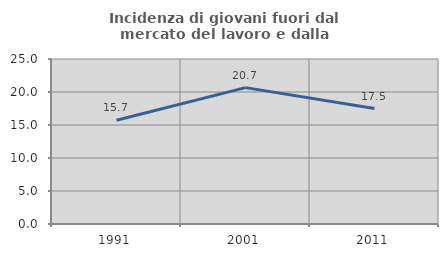
| Category | Incidenza di giovani fuori dal mercato del lavoro e dalla formazione  |
|---|---|
| 1991.0 | 15.726 |
| 2001.0 | 20.66 |
| 2011.0 | 17.49 |